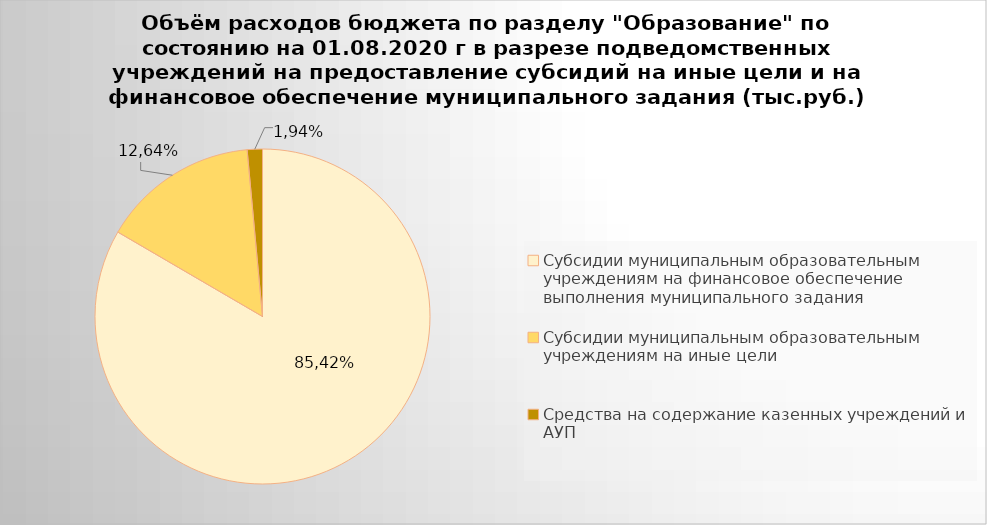
| Category | Series 0 |
|---|---|
| Субсидии муниципальным образовательным учреждениям на финансовое обеспечение выполнения муниципального задания | 4941888.88 |
| Субсидии муниципальным образовательным учреждениям на иные цели | 896479.65 |
| Средства на содержание казенных учреждений и АУП | 86831.82 |